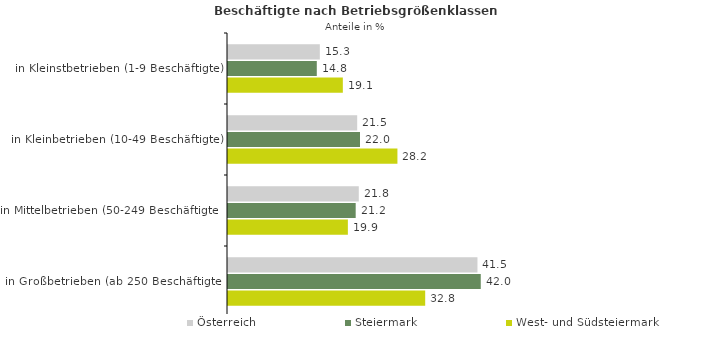
| Category | Österreich | Steiermark | West- und Südsteiermark |
|---|---|---|---|
| in Kleinstbetrieben (1-9 Beschäftigte) | 15.273 | 14.768 | 19.1 |
| in Kleinbetrieben (10-49 Beschäftigte) | 21.487 | 21.955 | 28.179 |
| in Mittelbetrieben (50-249 Beschäftigte) | 21.75 | 21.237 | 19.936 |
| in Großbetrieben (ab 250 Beschäftigte) | 41.489 | 42.04 | 32.798 |